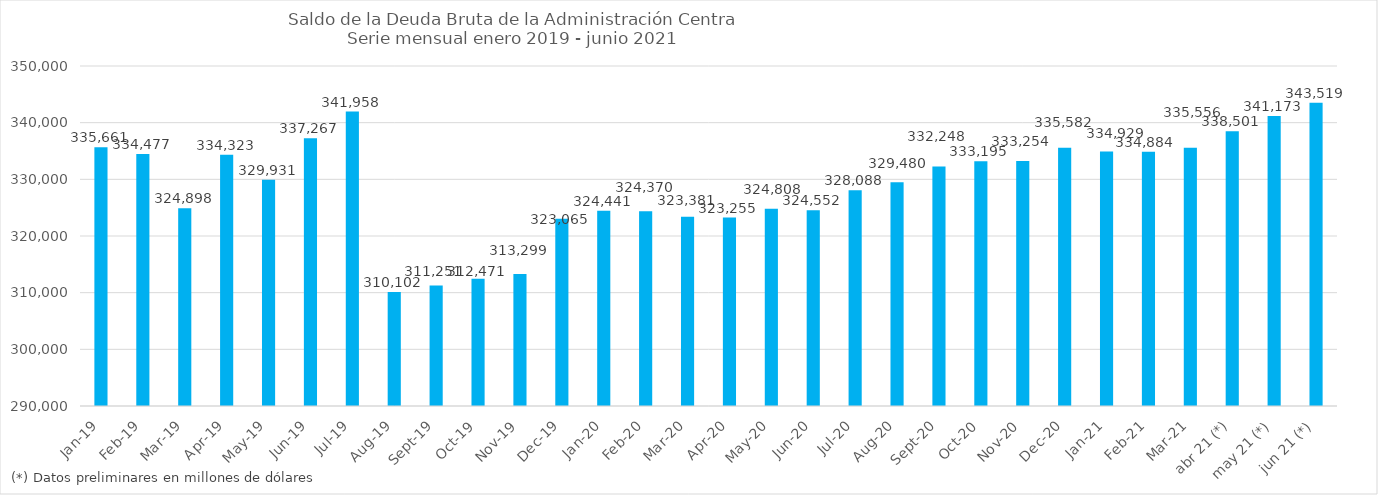
| Category | Series 0 |
|---|---|
| ene-19 | 335661.3 |
| feb-19 | 334477 |
| mar-19 | 324898.3 |
| abr-19 | 334322.9 |
| may-19 | 329930.6 |
| jun-19 | 337267.1 |
| jul-19 | 341957.5 |
| ago-19 | 310102.3 |
| sep-19 | 311251.2 |
| oct-19 | 312471 |
| nov-19 | 313299.1 |
| dic-19 | 323064.6 |
| ene-20 | 324440.6 |
| feb-20 | 324369.9 |
| mar-20 | 323381.2 |
| abr-20 | 323254.8 |
| may-20 | 324808.3 |
| jun-20 | 324552.4 |
| jul-20 | 328087.9 |
| ago-20 | 329479.5 |
| sep-20 | 332247.5 |
| oct-20 | 333194.7 |
| nov-20 | 333253.8 |
| dic-20 | 335582.2 |
| ene-21 | 334929.2 |
| feb-21 | 334883.8 |
| mar-21 | 335556.1 |
| abr 21 (*) | 338501 |
| may 21 (*) | 341173 |
| jun 21 (*) | 343519.3 |